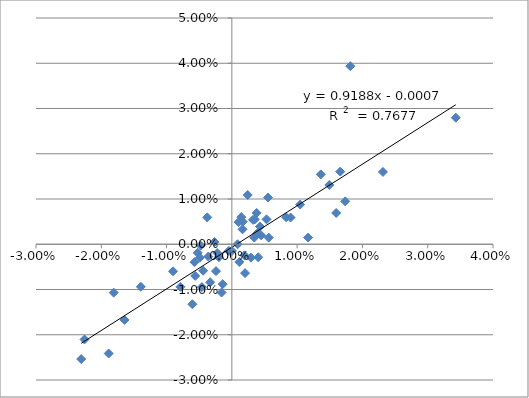
| Category | Series 0 |
|---|---|
| -0.003602831292501274 | -0.003 |
| -0.0037623922351610606 | 0.006 |
| 0.005313903166297429 | 0.006 |
| 0.0014524075106896461 | 0.006 |
| 0.01814740328877318 | 0.039 |
| 0.004038484380567864 | -0.003 |
| -0.0019915123639725474 | -0.003 |
| 0.0038555822643215887 | 0.002 |
| -0.005232255315119172 | -0.002 |
| 0.03429445974900536 | 0.028 |
| 0.004488992743819864 | 0.002 |
| -0.01810189713678456 | -0.011 |
| -0.0022410988613772442 | -0.002 |
| 0.0010252080569292943 | 0.005 |
| 0.0032429031243192963 | 0.005 |
| 0.0 | -0.001 |
| 0.01167858192145732 | 0.001 |
| 0.015981990721739336 | 0.007 |
| 0.0020189180094962733 | -0.006 |
| 0.0008731336767660025 | 0 |
| 0.003793759703510924 | 0.007 |
| 0.00831976164324777 | 0.006 |
| 0.014927476807954587 | 0.013 |
| -0.0056189080716060325 | -0.007 |
| -0.007875309703190614 | -0.009 |
| 0.0035011162979501353 | 0.005 |
| -0.0024296416278598576 | -0.006 |
| 0.001673173452314547 | 0.005 |
| -0.005721775514833882 | -0.004 |
| -0.00490362065289629 | -0.003 |
| 0.017365009696845846 | 0.009 |
| -0.003319048285158277 | -0.008 |
| -0.0014095596078631534 | -0.009 |
| -0.004399716799838194 | -0.006 |
| 0.004317131393163587 | 0.004 |
| 0.008993773541394523 | 0.006 |
| 0.0034324501523390616 | 0.001 |
| 0.0019191632963240224 | -0.002 |
| 0.023141192904773344 | 0.016 |
| -0.01394321356636996 | -0.009 |
| 0.0029323602241626556 | -0.003 |
| -0.0026516234694672347 | 0 |
| 0.01659663310341175 | 0.016 |
| -0.009009244951941997 | -0.006 |
| 0.0016395377815086043 | 0.003 |
| -0.004777631286958073 | 0 |
| -0.02257068490354197 | -0.021 |
| 0.00243010257590881 | 0.011 |
| -0.018860821443360987 | -0.024 |
| 0.010461046865489987 | 0.009 |
| 0.00554641777913778 | 0.01 |
| 0.0011488530616934334 | -0.004 |
| 0.01362471857775005 | 0.015 |
| -0.006044549616749828 | -0.013 |
| -0.0004627725215959888 | -0.001 |
| -0.0015786433934416033 | -0.011 |
| 0.005653290654000553 | 0.001 |
| -0.01642736540097256 | -0.017 |
| -0.004587155963302614 | -0.009 |
| -0.023073219510388543 | -0.025 |